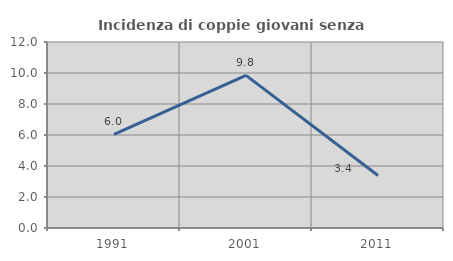
| Category | Incidenza di coppie giovani senza figli |
|---|---|
| 1991.0 | 6.04 |
| 2001.0 | 9.845 |
| 2011.0 | 3.384 |